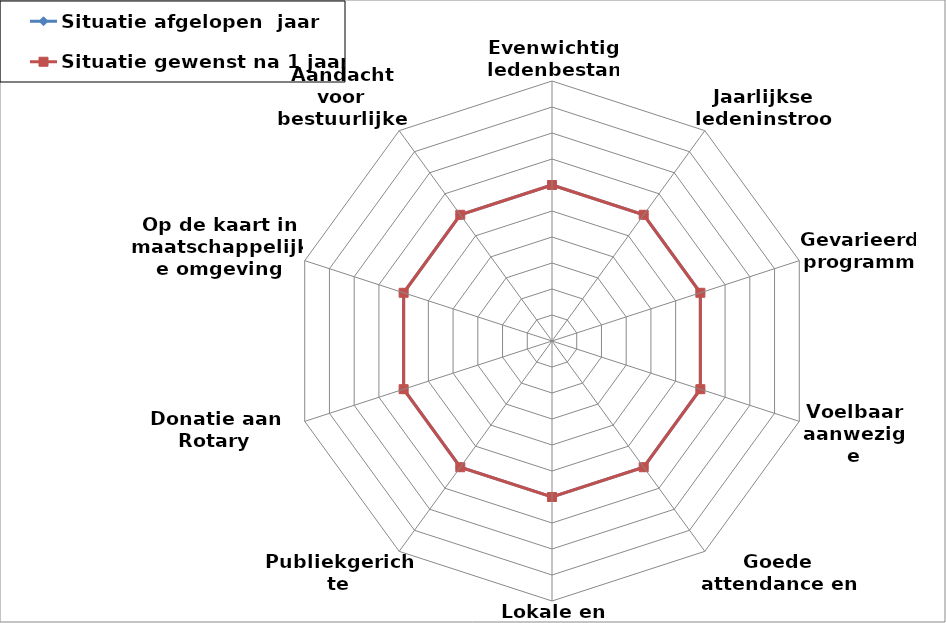
| Category | Situatie afgelopen  jaar | Situatie gewenst na 1 jaar |
|---|---|---|
| Evenwichtig ledenbestand | 6 | 6 |
| Jaarlijkse ledeninstroom | 6 | 6 |
| Gevarieerd programma | 6 | 6 |
| Voelbaar aanwezige fellowship | 6 | 6 |
| Goede attendance en betrokkenheid | 6 | 6 |
| Lokale en internationale projecten | 6 | 6 |
| Publiekgerichte fondswerving | 6 | 6 |
| Donatie aan Rotary Foundation | 6 | 6 |
| Op de kaart in maatschappelijke omgeving | 6 | 6 |
| Aandacht voor bestuurlijke continuïteit | 6 | 6 |